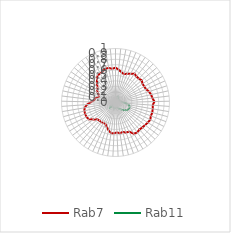
| Category | Rab7 | Rab11 |
|---|---|---|
| 0.0 | 0.645 | 0.043 |
| 0.10913 | 0.611 | 0.056 |
| 0.21825 | 0.572 | 0.091 |
| 0.32738 | 0.547 | 0.106 |
| 0.43651 | 0.577 | 0.112 |
| 0.54563 | 0.6 | 0.109 |
| 0.65476 | 0.64 | 0.082 |
| 0.76389 | 0.621 | 0.069 |
| 0.87302 | 0.618 | 0.072 |
| 0.98214 | 0.636 | 0.075 |
| 1.09127 | 0.609 | 0.068 |
| 1.2004 | 0.609 | 0.074 |
| 1.30952 | 0.618 | 0.071 |
| 1.41865 | 0.653 | 0.073 |
| 1.52778 | 0.674 | 0.089 |
| 1.6369 | 0.688 | 0.108 |
| 1.74603 | 0.721 | 0.145 |
| 1.85516 | 0.691 | 0.193 |
| 1.96429 | 0.7 | 0.244 |
| 2.07341 | 0.706 | 0.273 |
| 2.18254 | 0.701 | 0.273 |
| 2.29167 | 0.719 | 0.27 |
| 2.40079 | 0.705 | 0.258 |
| 2.50992 | 0.689 | 0.233 |
| 2.61905 | 0.677 | 0.202 |
| 2.72817 | 0.669 | 0.188 |
| 2.8373 | 0.683 | 0.151 |
| 2.94643 | 0.672 | 0.136 |
| 3.05556 | 0.595 | 0.115 |
| 3.16468 | 0.591 | 0.104 |
| 3.27381 | 0.561 | 0.089 |
| 3.38294 | 0.575 | 0.084 |
| 3.49206 | 0.556 | 0.095 |
| 3.60119 | 0.57 | 0.101 |
| 3.71032 | 0.573 | 0.111 |
| 3.81944 | 0.533 | 0.113 |
| 3.92857 | 0.481 | 0.098 |
| 4.0377 | 0.44 | 0.083 |
| 4.14683 | 0.439 | 0.076 |
| 4.25595 | 0.449 | 0.089 |
| 4.36508 | 0.449 | 0.098 |
| 4.47421 | 0.458 | 0.131 |
| 4.58333 | 0.518 | 0.114 |
| 4.69246 | 0.585 | 0.071 |
| 4.80159 | 0.599 | 0.056 |
| 4.91071 | 0.603 | 0.043 |
| 5.01984 | 0.595 | 0.047 |
| 5.12897 | 0.579 | 0.04 |
| 5.2381 | 0.528 | 0.046 |
| 5.34722 | 0.449 | 0.033 |
| 5.45635 | 0.395 | 0.025 |
| 5.56548 | 0.379 | 0.001 |
| 5.6746 | 0.327 | 0.003 |
| 5.78373 | 0.336 | 0.002 |
| 5.89286 | 0.383 | 0 |
| 6.00198 | 0.41 | 0.009 |
| 6.11111 | 0.437 | 0.015 |
| 6.22024 | 0.49 | 0.012 |
| 6.32937 | 0.55 | 0.022 |
| 6.43849 | 0.599 | 0.02 |
| 6.54762 | 0.609 | 0.031 |
| 6.65675 | 0.626 | 0.038 |
| 6.76587 | 0.653 | 0.033 |
| 6.875 | 0.653 | 0.045 |
| 6.98413 | 0.628 | 0.043 |